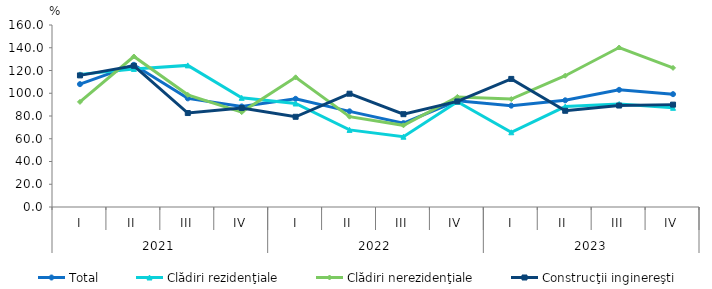
| Category | Total | Clădiri rezidenţiale | Clădiri nerezidenţiale | Construcţii inginereşti |
|---|---|---|---|---|
| 0 | 108 | 116.6 | 92.4 | 115.7 |
| 1 | 125 | 121.4 | 132.3 | 124.1 |
| 2 | 95.5 | 124.5 | 98.6 | 82.6 |
| 3 | 88.4 | 96 | 83.4 | 87 |
| 4 | 95.1 | 91 | 114 | 79.3 |
| 5 | 84.1 | 67.8 | 79.4 | 99.6 |
| 6 | 73.7 | 61.8 | 71.8 | 81.6 |
| 7 | 93.4 | 92.5 | 96.8 | 92.8 |
| 8 | 89.1 | 65.7 | 94.9 | 112.6 |
| 9 | 93.8 | 88.3 | 115.4 | 84.6 |
| 10 | 103 | 90.5 | 140.2 | 89.2 |
| 11 | 99.2 | 87.2 | 122.3 | 90 |